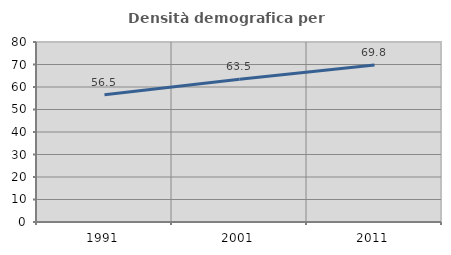
| Category | Densità demografica |
|---|---|
| 1991.0 | 56.515 |
| 2001.0 | 63.48 |
| 2011.0 | 69.828 |